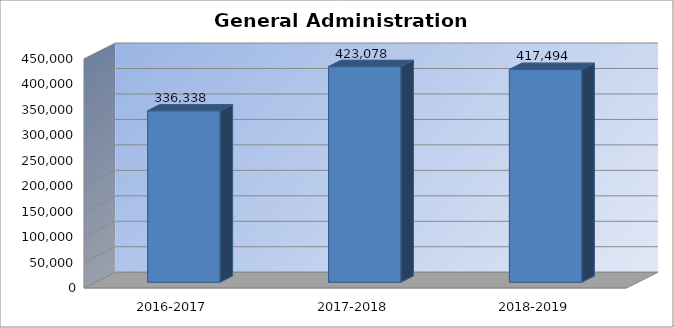
| Category | General Administration Expenditures |
|---|---|
| 2016-2017 | 336338 |
| 2017-2018 | 423078 |
| 2018-2019 | 417494 |